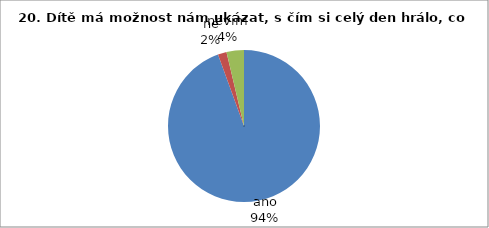
| Category | 20. |
|---|---|
| ano | 51 |
| ne | 1 |
| nevím | 2 |